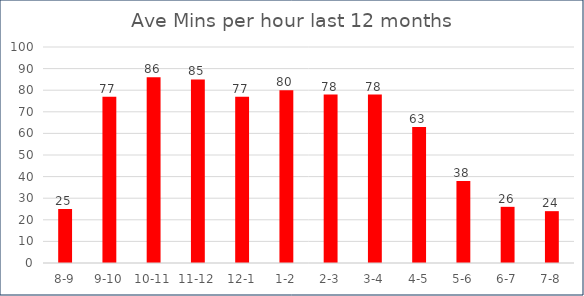
| Category | Ave Mins YTD |
|---|---|
| 8-9 | 25 |
| 9-10 | 77 |
| 10-11 | 86 |
| 11-12 | 85 |
| 12-1 | 77 |
| 1-2 | 80 |
| 2-3 | 78 |
| 3-4 | 78 |
| 4-5 | 63 |
| 5-6 | 38 |
| 6-7 | 26 |
| 7-8 | 24 |